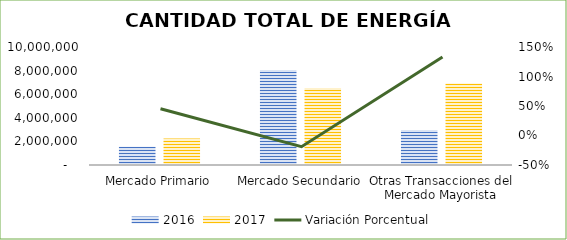
| Category | 2016 | 2017 |
|---|---|---|
| Mercado Primario | 1542477 | 2241066 |
| Mercado Secundario | 8056964 | 6526346 |
| Otras Transacciones del Mercado Mayorista | 2963746 | 6909704 |